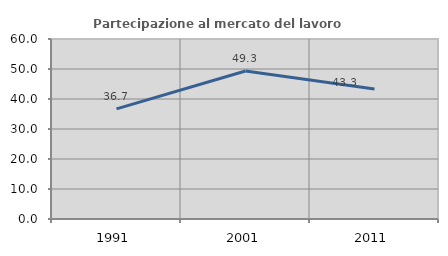
| Category | Partecipazione al mercato del lavoro  femminile |
|---|---|
| 1991.0 | 36.709 |
| 2001.0 | 49.339 |
| 2011.0 | 43.333 |